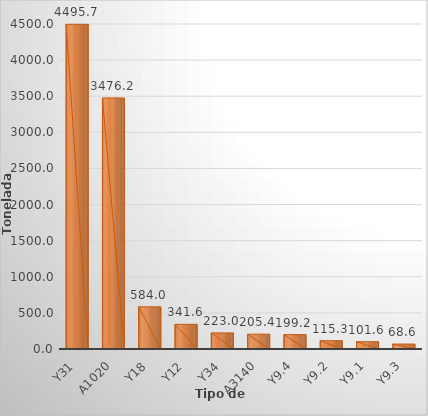
| Category | Series 0 |
|---|---|
| Y31 | 4495.707 |
| A1020 | 3476.234 |
| Y18 | 583.98 |
| Y12 | 341.649 |
| Y34 | 222.965 |
| A3140 | 205.357 |
| Y9.4 | 199.225 |
| Y9.2 | 115.27 |
| Y9.1 | 101.558 |
| Y9.3 | 68.597 |